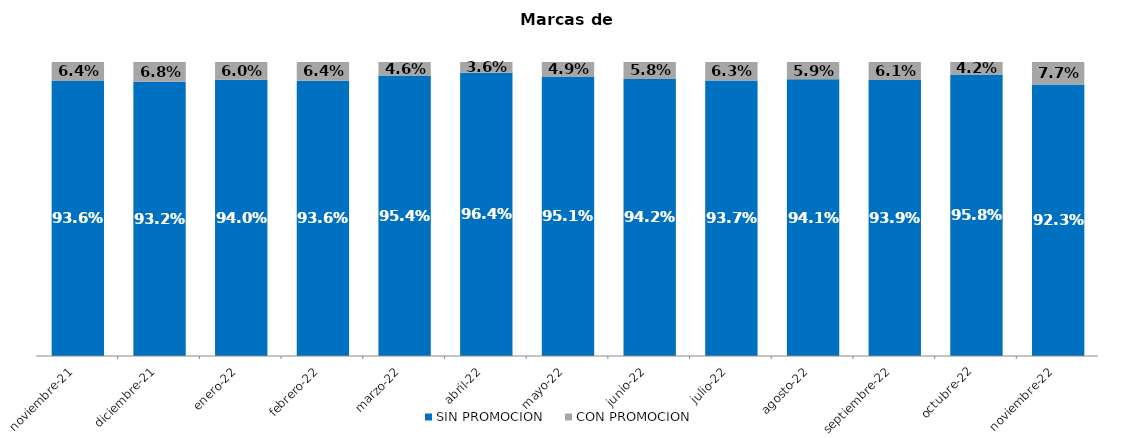
| Category | SIN PROMOCION   | CON PROMOCION   |
|---|---|---|
| 2021-11-01 | 0.936 | 0.064 |
| 2021-12-01 | 0.932 | 0.068 |
| 2022-01-01 | 0.94 | 0.06 |
| 2022-02-01 | 0.936 | 0.064 |
| 2022-03-01 | 0.954 | 0.046 |
| 2022-04-01 | 0.964 | 0.036 |
| 2022-05-01 | 0.951 | 0.049 |
| 2022-06-01 | 0.942 | 0.058 |
| 2022-07-01 | 0.937 | 0.063 |
| 2022-08-01 | 0.941 | 0.059 |
| 2022-09-01 | 0.939 | 0.061 |
| 2022-10-01 | 0.958 | 0.042 |
| 2022-11-01 | 0.923 | 0.077 |